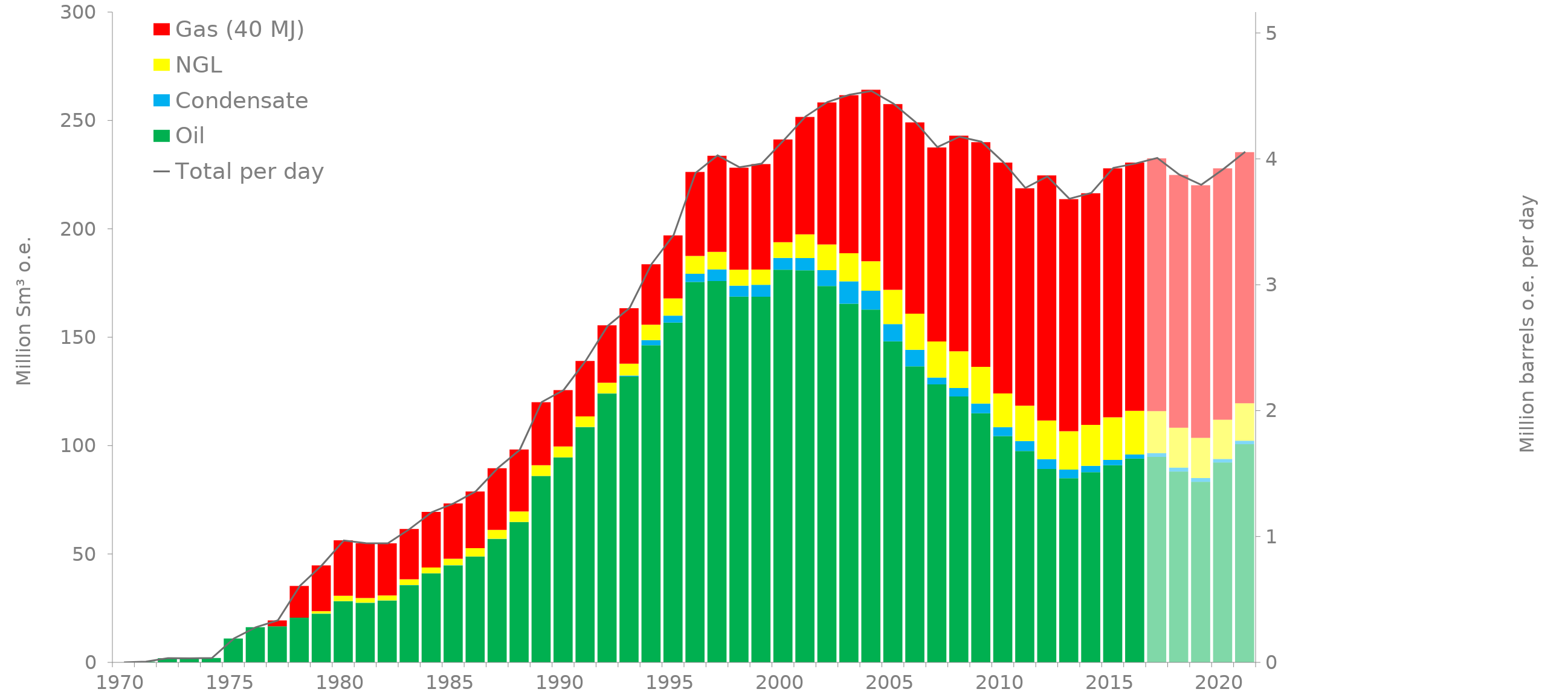
| Category | Oil | Condensate | NGL | Gas (40 MJ) |
|---|---|---|---|---|
| 1970.0 | 0 | 0 | 0 | 0 |
| 1971.0 | 0.357 | 0 | 0 | 0 |
| 1972.0 | 1.927 | 0 | 0 | 0 |
| 1973.0 | 1.87 | 0 | 0 | 0 |
| 1974.0 | 2.014 | 0 | 0 | 0 |
| 1975.0 | 10.995 | 0 | 0 | 0 |
| 1976.0 | 16.227 | 0 | 0 | 0 |
| 1977.0 | 16.643 | 0.002 | 0 | 2.722 |
| 1978.0 | 20.644 | 0.021 | 0 | 14.617 |
| 1979.0 | 22.478 | 0.044 | 1.128 | 21.113 |
| 1980.0 | 28.221 | 0.048 | 2.44 | 25.637 |
| 1981.0 | 27.485 | 0.048 | 2.168 | 25.281 |
| 1982.0 | 28.528 | 0.043 | 2.286 | 24.059 |
| 1983.0 | 35.645 | 0.041 | 2.68 | 23.168 |
| 1984.0 | 41.093 | 0.064 | 2.642 | 25.635 |
| 1985.0 | 44.758 | 0.076 | 2.968 | 25.514 |
| 1986.0 | 48.771 | 0.061 | 3.845 | 26.147 |
| 1987.0 | 56.959 | 0.055 | 4.117 | 28.404 |
| 1988.0 | 64.723 | 0.047 | 4.846 | 28.585 |
| 1989.0 | 85.983 | 0.053 | 4.898 | 29.079 |
| 1990.0 | 94.542 | 0.048 | 5.011 | 25.986 |
| 1991.0 | 108.51 | 0.057 | 4.897 | 25.562 |
| 1992.0 | 123.999 | 0.054 | 4.959 | 26.5 |
| 1993.0 | 131.843 | 0.474 | 5.518 | 25.562 |
| 1994.0 | 146.282 | 2.403 | 7.122 | 27.879 |
| 1995.0 | 156.776 | 3.178 | 7.942 | 29.068 |
| 1996.0 | 175.501 | 3.784 | 8.232 | 38.749 |
| 1997.0 | 175.914 | 5.376 | 8.074 | 44.356 |
| 1998.0 | 168.744 | 5.047 | 7.39 | 47.055 |
| 1999.0 | 168.69 | 5.512 | 6.992 | 48.698 |
| 2000.0 | 181.181 | 5.411 | 7.225 | 47.432 |
| 2001.0 | 180.884 | 5.666 | 10.924 | 54.148 |
| 2002.0 | 173.649 | 7.323 | 11.798 | 65.533 |
| 2003.0 | 165.475 | 10.339 | 12.931 | 72.934 |
| 2004.0 | 162.778 | 8.675 | 13.602 | 79.095 |
| 2005.0 | 148.137 | 7.952 | 15.806 | 85.667 |
| 2006.0 | 136.577 | 7.625 | 16.696 | 88.227 |
| 2007.0 | 128.276 | 3.126 | 16.629 | 89.505 |
| 2008.0 | 122.662 | 3.924 | 16.942 | 99.463 |
| 2009.0 | 114.937 | 4.44 | 16.962 | 103.68 |
| 2010.0 | 104.388 | 4.163 | 15.505 | 106.533 |
| 2011.0 | 97.513 | 4.583 | 16.314 | 100.298 |
| 2012.0 | 89.197 | 4.575 | 17.799 | 113.058 |
| 2013.0 | 84.948 | 3.991 | 17.718 | 107.051 |
| 2014.0 | 87.741 | 2.913 | 18.949 | 106.796 |
| 2015.0 | 90.965 | 2.468 | 19.601 | 114.916 |
| 2016.0 | 94.009 | 1.879 | 20.176 | 114.525 |
| 2017.0 | 94.797 | 1.733 | 19.375 | 116.648 |
| 2018.0 | 88.054 | 1.759 | 18.421 | 116.623 |
| 2019.0 | 83.298 | 1.744 | 18.56 | 116.543 |
| 2020.0 | 92.231 | 1.6 | 18.132 | 115.999 |
| 2021.0 | 100.653 | 1.574 | 17.325 | 115.813 |